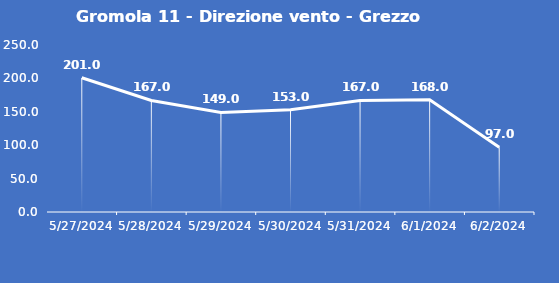
| Category | Gromola 11 - Direzione vento - Grezzo (°N) |
|---|---|
| 5/27/24 | 201 |
| 5/28/24 | 167 |
| 5/29/24 | 149 |
| 5/30/24 | 153 |
| 5/31/24 | 167 |
| 6/1/24 | 168 |
| 6/2/24 | 97 |